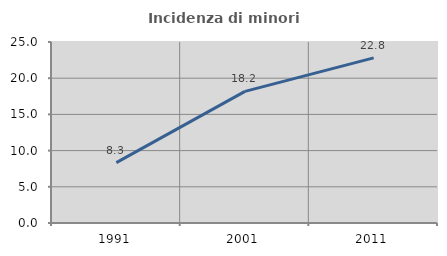
| Category | Incidenza di minori stranieri |
|---|---|
| 1991.0 | 8.333 |
| 2001.0 | 18.182 |
| 2011.0 | 22.807 |